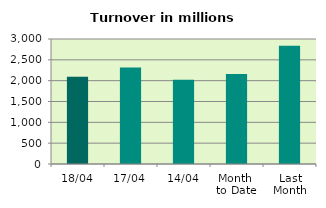
| Category | Series 0 |
|---|---|
| 18/04 | 2092.288 |
| 17/04 | 2316.786 |
| 14/04 | 2021.285 |
| Month 
to Date | 2158.81 |
| Last
Month | 2840.905 |